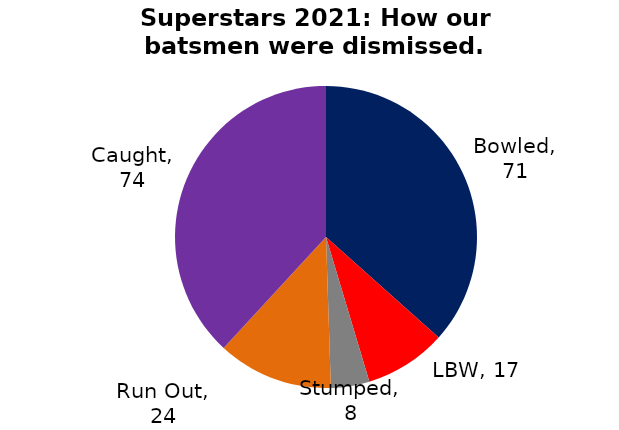
| Category | BATTING |
|---|---|
| Bowled | 71 |
| LBW | 17 |
| Stumped | 8 |
| Run Out | 24 |
| Caught | 74 |